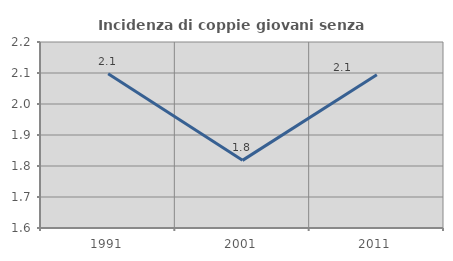
| Category | Incidenza di coppie giovani senza figli |
|---|---|
| 1991.0 | 2.098 |
| 2001.0 | 1.818 |
| 2011.0 | 2.094 |